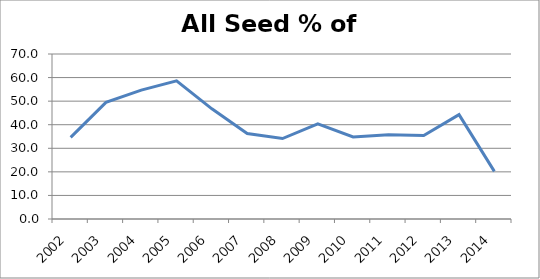
| Category | VC as % of All Seed |
|---|---|
| 2002.0 | 34.634 |
| 2003.0 | 49.481 |
| 2004.0 | 54.674 |
| 2005.0 | 58.627 |
| 2006.0 | 46.744 |
| 2007.0 | 36.278 |
| 2008.0 | 34.137 |
| 2009.0 | 40.384 |
| 2010.0 | 34.821 |
| 2011.0 | 35.789 |
| 2012.0 | 35.381 |
| 2013.0 | 44.273 |
| 2014.0 | 20.189 |